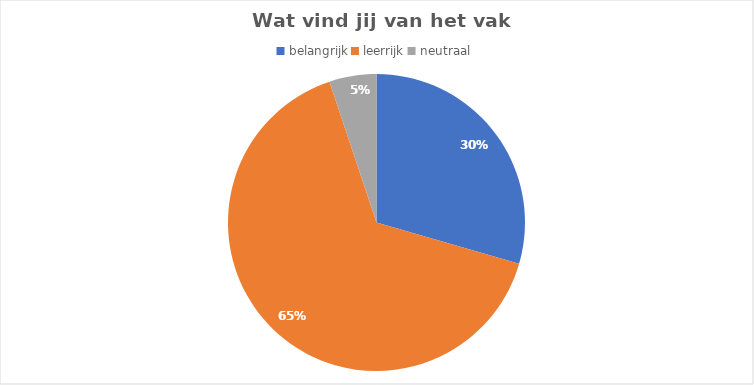
| Category | Series 0 |
|---|---|
| belangrijk | 23 |
| leerrijk | 51 |
| neutraal | 4 |